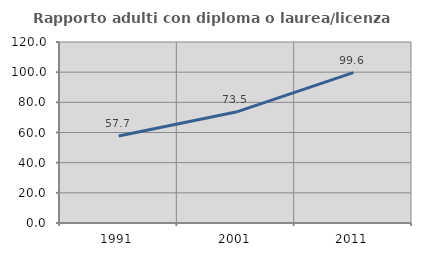
| Category | Rapporto adulti con diploma o laurea/licenza media  |
|---|---|
| 1991.0 | 57.692 |
| 2001.0 | 73.536 |
| 2011.0 | 99.647 |